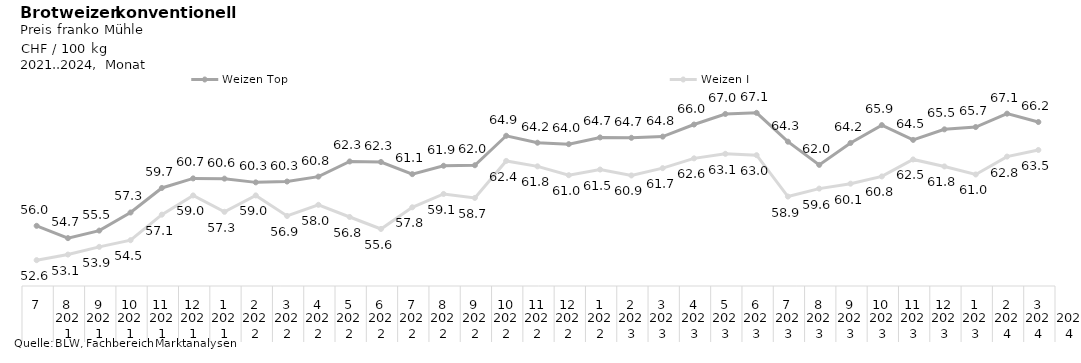
| Category | Weizen Top | Weizen I |
|---|---|---|
| 0 | 66.235 | 63.467 |
| 1 | 67.063 | 62.813 |
| 2 | 65.737 | 61.042 |
| 3 | 65.51 | 61.837 |
| 4 | 64.466 | 62.529 |
| 5 | 65.931 | 60.848 |
| 6 | 64.163 | 60.13 |
| 7 | 61.992 | 59.643 |
| 8 | 64.29 | 58.856 |
| 9 | 67.141 | 62.952 |
| 10 | 67.034 | 63.088 |
| 11 | 65.988 | 62.639 |
| 12 | 64.791 | 61.672 |
| 13 | 64.673 | 60.946 |
| 14 | 64.709 | 61.531 |
| 15 | 64.045 | 60.971 |
| 16 | 64.187 | 61.847 |
| 17 | 64.873 | 62.384 |
| 18 | 61.956 | 58.722 |
| 19 | 61.905 | 59.111 |
| 20 | 61.074 | 57.793 |
| 21 | 62.279 | 55.649 |
| 22 | 62.33 | 56.834 |
| 23 | 60.831 | 58.036 |
| 24 | 60.344 | 56.935 |
| 25 | 60.26 | 58.968 |
| 26 | 60.629 | 57.345 |
| 27 | 60.652 | 58.966 |
| 28 | 59.707 | 57.064 |
| 29 | 57.278 | 54.534 |
| 30 | 55.486 | 53.876 |
| 31 | 54.739 | 53.113 |
| 32 | 55.958 | 52.559 |